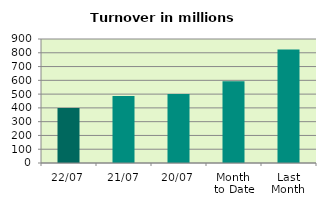
| Category | Series 0 |
|---|---|
| 22/07 | 398.43 |
| 21/07 | 485.919 |
| 20/07 | 500.272 |
| Month 
to Date | 594.049 |
| Last
Month | 824.124 |